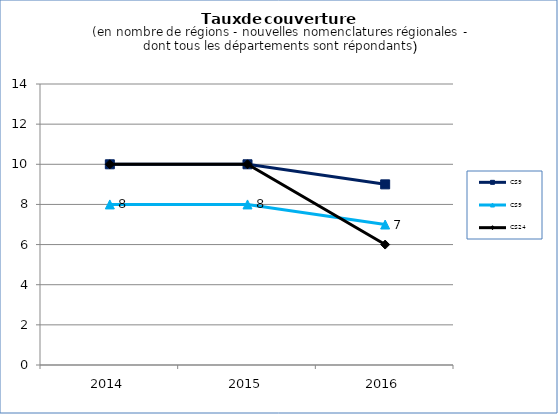
| Category | CS9 | CS24 |
|---|---|---|
| 2014.0 | 8 | 10 |
| 2015.0 | 8 | 10 |
| 2016.0 | 7 | 6 |